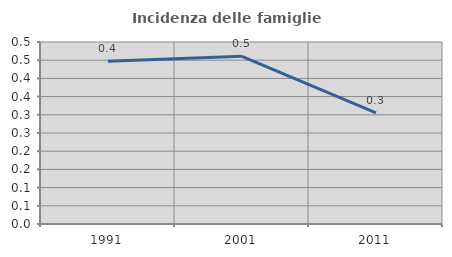
| Category | Incidenza delle famiglie numerose |
|---|---|
| 1991.0 | 0.447 |
| 2001.0 | 0.461 |
| 2011.0 | 0.305 |